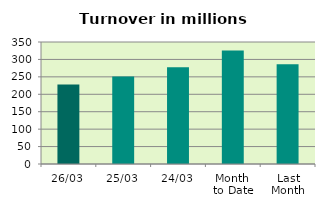
| Category | Series 0 |
|---|---|
| 26/03 | 228.302 |
| 25/03 | 251.298 |
| 24/03 | 277.282 |
| Month 
to Date | 325.939 |
| Last
Month | 285.972 |